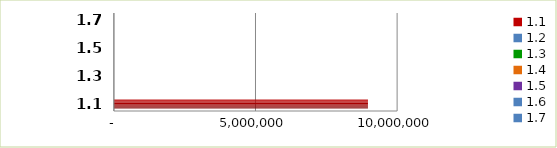
| Category | Series 0 |
|---|---|
| 1.1 | 8970767 |
| 1.2 | 0 |
| 1.3 | 0 |
| 1.4 | 0 |
| 1.5 | 0 |
| 1.6 | 0 |
| 1.7 | 0 |